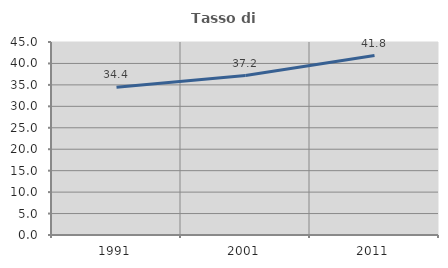
| Category | Tasso di occupazione   |
|---|---|
| 1991.0 | 34.446 |
| 2001.0 | 37.182 |
| 2011.0 | 41.846 |